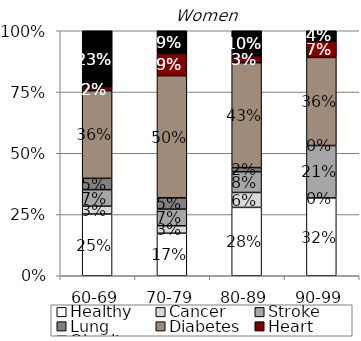
| Category | Healthy | Cancer | Stroke | Lung | Diabetes | Heart | Obesity |
|---|---|---|---|---|---|---|---|
| 60-69 | 0.252 | 0.032 | 0.067 | 0.046 | 0.357 | 0.016 | 0.229 |
| 70-79 | 0.174 | 0.03 | 0.068 | 0.046 | 0.499 | 0.091 | 0.093 |
| 80-89 | 0.279 | 0.061 | 0.085 | 0.017 | 0.428 | 0.028 | 0.102 |
| 90-99 | 0.318 | 0 | 0.214 | 0 | 0.36 | 0.068 | 0.041 |